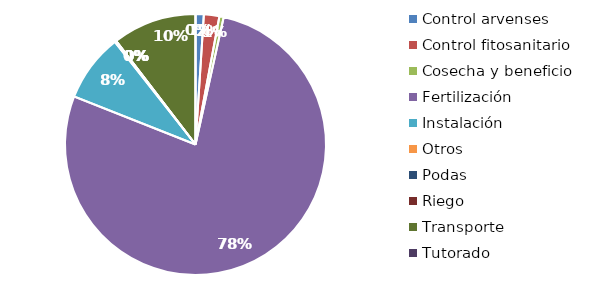
| Category | Valor |
|---|---|
| Control arvenses | 622100 |
| Control fitosanitario | 1167820 |
| Cosecha y beneficio | 325103.694 |
| Fertilización | 47239254 |
| Instalación | 5116854.331 |
| Otros | 112900 |
| Podas | 0 |
| Riego | 0 |
| Transporte | 6348793 |
| Tutorado | 0 |